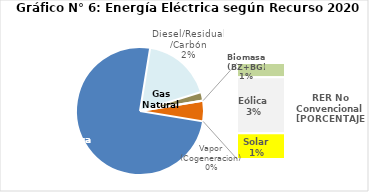
| Category | Series 0 |
|---|---|
| Agua | 3228.739 |
| Gas Natural | 761.482 |
| Diesel/Residual/Carbón | 93.839 |
| Vapor (Cogeneracion) | 0.275 |
| Biomasa (BZ+BG) | 33.243 |
| Eólica | 130.415 |
| Solar | 60.129 |